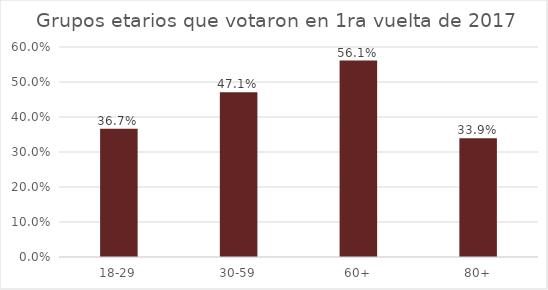
| Category | Votó |
|---|---|
| 18-29 | 0.367 |
| 30-59 | 0.471 |
| 60+ | 0.561 |
| 80+ | 0.339 |